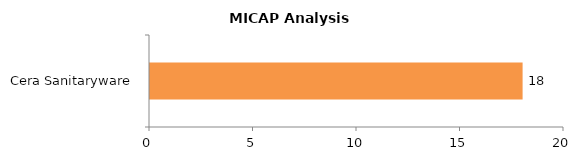
| Category | MICAP 18 |
|---|---|
| Cera Sanitaryware | 18 |